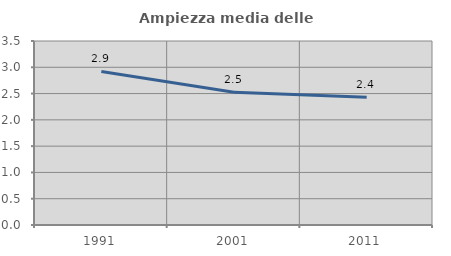
| Category | Ampiezza media delle famiglie |
|---|---|
| 1991.0 | 2.92 |
| 2001.0 | 2.525 |
| 2011.0 | 2.43 |